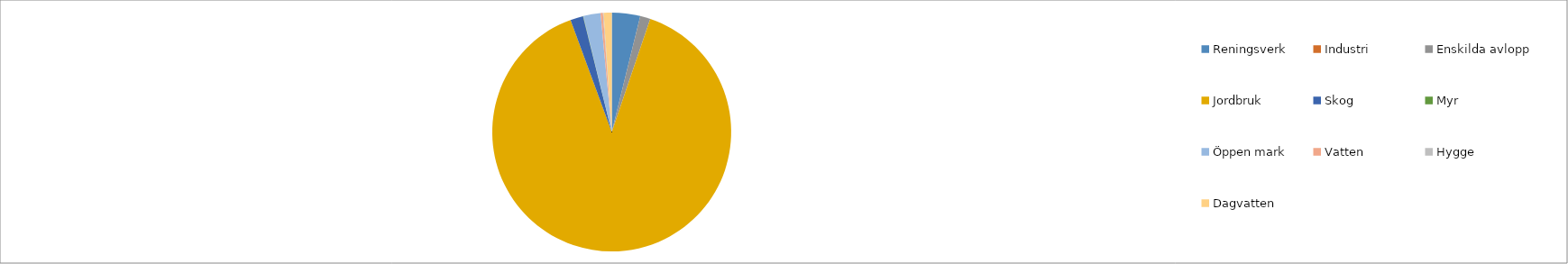
| Category | Series 1 | Series 0 |
|---|---|---|
| Reningsverk | 21360 | 21360 |
| Industri | 0 | 0 |
| Enskilda avlopp | 7708 | 7708 |
| Jordbruk | 496361 | 496361 |
| Skog | 9657 | 9657 |
| Myr | 245 | 245 |
| Öppen mark | 12952 | 12952 |
| Vatten | 1772 | 1772 |
| Hygge  | 528 | 528 |
| Dagvatten | 6062 | 6062 |